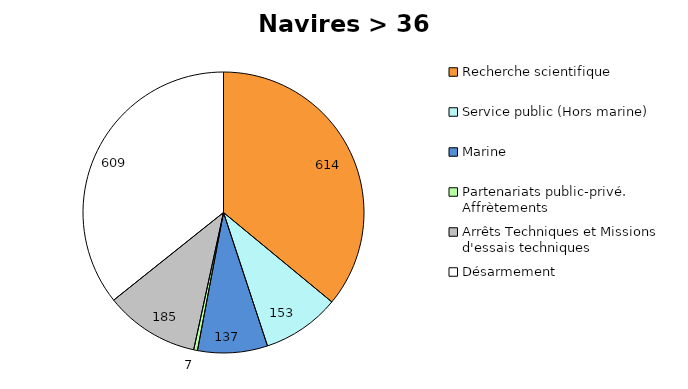
| Category | Service public (Hors marine) |
|---|---|
| Recherche scientifique | 613.53 |
| Service public (Hors marine) | 152.561 |
| Marine | 137 |
| Partenariats public-privé. Affrètements | 7.484 |
| Arrêts Techniques et Missions d'essais techniques | 185.425 |
| Désarmement | 609 |